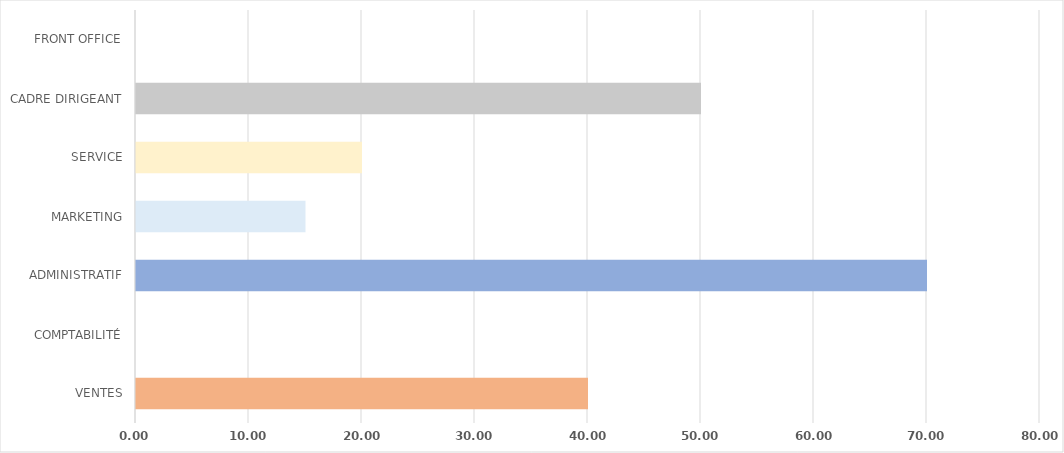
| Category | Series 0 |
|---|---|
| VENTES | 40 |
| COMPTABILITÉ | 0 |
| ADMINISTRATIF | 70 |
| MARKETING | 15 |
| SERVICE | 20 |
| CADRE DIRIGEANT | 50 |
| FRONT OFFICE | 0 |